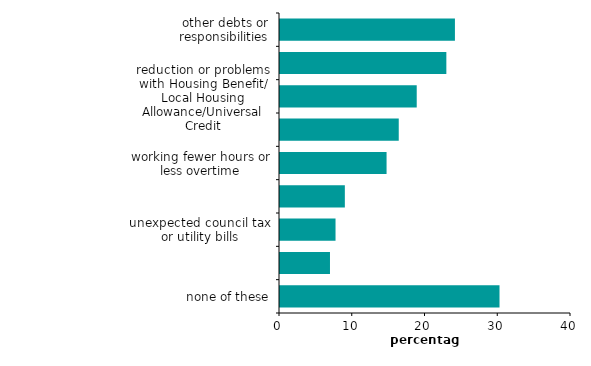
| Category | Series 0 |
|---|---|
| other debts or responsibilities | 24.045 |
| unemployment  | 22.866 |
| reduction or problems with Housing Benefit/ Local Housing Allowance/Universal Credit | 18.794 |
| illness | 16.323 |
| working fewer hours or less overtime | 14.648 |
| increase in rent | 8.913 |
| unexpected council tax or utility bills | 7.633 |
| domestic problems | 6.87 |
| none of these | 30.173 |